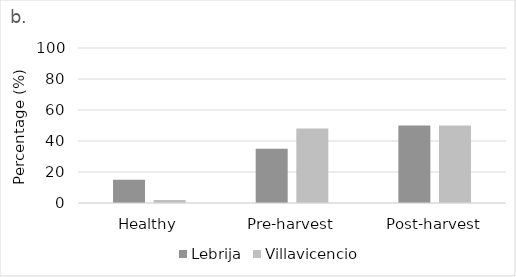
| Category | Lebrija | Villavicencio |
|---|---|---|
| Healthy | 15 | 2 |
| Pre-harvest | 35 | 48 |
| Post-harvest | 50 | 50 |